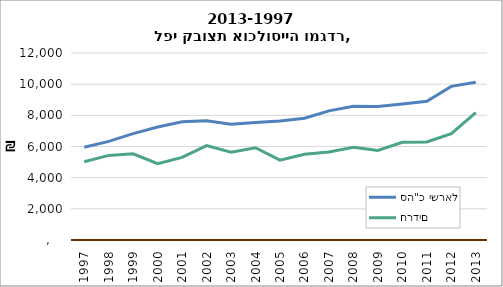
| Category | סה"כ ישראל | חרדים |
|---|---|---|
| 1997.0 | 5955.6 | 5018.6 |
| 1998.0 | 6329.19 | 5427.41 |
| 1999.0 | 6823.92 | 5530.21 |
| 2000.0 | 7248.63 | 4899.01 |
| 2001.0 | 7585.99 | 5298.96 |
| 2002.0 | 7659.21 | 6054.84 |
| 2003.0 | 7427.92 | 5632.06 |
| 2004.0 | 7544.91 | 5920.51 |
| 2005.0 | 7634.25 | 5120.85 |
| 2006.0 | 7817.35 | 5498.91 |
| 2007.0 | 8286.09 | 5643.53 |
| 2008.0 | 8577.27 | 5951.81 |
| 2009.0 | 8568.94 | 5751.39 |
| 2010.0 | 8729.04 | 6269.13 |
| 2011.0 | 8907.041 | 6294.55 |
| 2012.0 | 9857.052 | 6824.18 |
| 2013.0 | 10122.34 | 8171.5 |